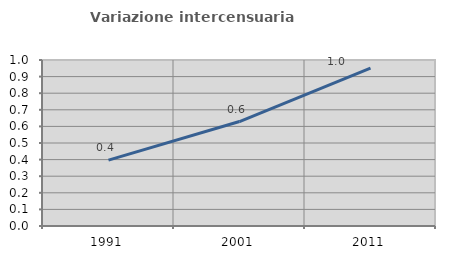
| Category | Variazione intercensuaria annua |
|---|---|
| 1991.0 | 0.397 |
| 2001.0 | 0.629 |
| 2011.0 | 0.951 |